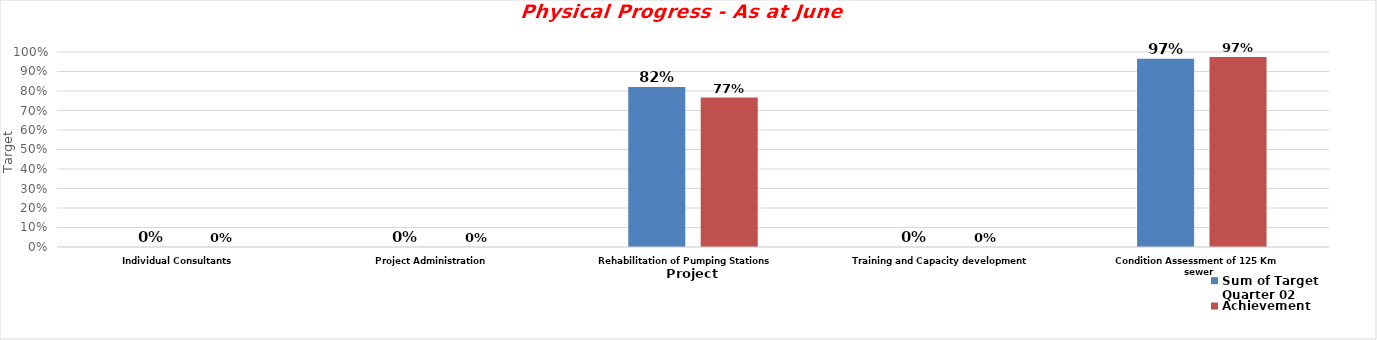
| Category | Sum of Target Quarter 02 | Achievement |
|---|---|---|
| Individual Consultants  | 0 | 0 |
| Project Administration  | 0 | 0 |
| Rehabilitation of Pumping Stations | 0.82 | 0.767 |
| Training and Capacity development  | 0 | 0 |
| Condition Assessment of 125 Km sewer  | 0.965 | 0.974 |